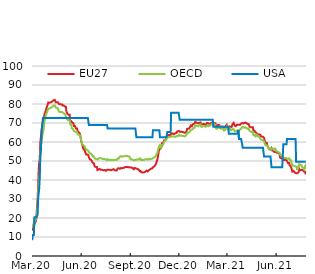
| Category | EU27 | OECD | USA |
|---|---|---|---|
| 2020-03-01 | 13.34 | 15.115 | 8.33 |
| 2020-03-02 | 13.991 | 15.84 | 11.11 |
| 2020-03-03 | 14.334 | 16.241 | 11.11 |
| 2020-03-04 | 15.466 | 17.442 | 11.11 |
| 2020-03-05 | 16.975 | 18.042 | 20.37 |
| 2020-03-06 | 17.592 | 18.493 | 20.37 |
| 2020-03-07 | 17.798 | 18.643 | 20.37 |
| 2020-03-08 | 18.313 | 18.643 | 20.37 |
| 2020-03-09 | 21.518 | 20.857 | 20.37 |
| 2020-03-10 | 26.353 | 24.311 | 20.37 |
| 2020-03-11 | 29.646 | 26.714 | 21.76 |
| 2020-03-12 | 37.071 | 33.184 | 30.09 |
| 2020-03-13 | 45.13 | 37.638 | 30.09 |
| 2020-03-14 | 49.143 | 40.916 | 35.65 |
| 2020-03-15 | 51.046 | 43.03 | 41.2 |
| 2020-03-16 | 59.62 | 53.567 | 52.31 |
| 2020-03-17 | 62.038 | 57.208 | 55.09 |
| 2020-03-18 | 65.192 | 60.161 | 55.09 |
| 2020-03-19 | 67.215 | 61.712 | 67.13 |
| 2020-03-20 | 68.896 | 63.238 | 67.13 |
| 2020-03-21 | 70.507 | 65.29 | 72.69 |
| 2020-03-22 | 71.039 | 66.104 | 72.69 |
| 2020-03-23 | 73.405 | 68.506 | 72.69 |
| 2020-03-24 | 74.64 | 70.846 | 72.69 |
| 2020-03-25 | 75.326 | 72.848 | 72.69 |
| 2020-03-26 | 75.669 | 73.549 | 72.69 |
| 2020-03-27 | 77.212 | 74.75 | 72.69 |
| 2020-03-28 | 78.206 | 75.301 | 72.69 |
| 2020-03-29 | 78.721 | 75.676 | 72.69 |
| 2020-03-30 | 79.733 | 76.84 | 72.69 |
| 2020-03-31 | 80.83 | 77.491 | 72.69 |
| 2020-04-01 | 80.967 | 77.891 | 72.69 |
| 2020-04-02 | 80.658 | 77.715 | 72.69 |
| 2020-04-03 | 80.864 | 77.865 | 72.69 |
| 2020-04-04 | 80.864 | 77.89 | 72.69 |
| 2020-04-05 | 80.864 | 77.89 | 72.69 |
| 2020-04-06 | 81.07 | 78.141 | 72.69 |
| 2020-04-07 | 81.07 | 78.266 | 72.69 |
| 2020-04-08 | 81.516 | 78.766 | 72.69 |
| 2020-04-09 | 81.927 | 79.066 | 72.69 |
| 2020-04-10 | 81.996 | 79.116 | 72.69 |
| 2020-04-11 | 81.996 | 79.092 | 72.69 |
| 2020-04-12 | 82.201 | 79.242 | 72.69 |
| 2020-04-13 | 82.201 | 79.142 | 72.69 |
| 2020-04-14 | 80.899 | 78.166 | 72.69 |
| 2020-04-15 | 80.83 | 77.966 | 72.69 |
| 2020-04-16 | 80.899 | 78.016 | 72.69 |
| 2020-04-17 | 80.899 | 77.941 | 72.69 |
| 2020-04-18 | 80.899 | 77.741 | 72.69 |
| 2020-04-19 | 80.899 | 77.64 | 72.69 |
| 2020-04-20 | 80.007 | 75.988 | 72.69 |
| 2020-04-21 | 79.87 | 75.814 | 72.69 |
| 2020-04-22 | 79.87 | 75.814 | 72.69 |
| 2020-04-23 | 79.767 | 75.738 | 72.69 |
| 2020-04-24 | 79.767 | 75.814 | 72.69 |
| 2020-04-25 | 79.767 | 75.814 | 72.69 |
| 2020-04-26 | 79.767 | 75.714 | 72.69 |
| 2020-04-27 | 79.183 | 75.513 | 72.69 |
| 2020-04-28 | 79.183 | 75.338 | 72.69 |
| 2020-04-29 | 79.183 | 75.237 | 72.69 |
| 2020-04-30 | 78.772 | 74.862 | 72.69 |
| 2020-05-01 | 78.703 | 74.561 | 72.69 |
| 2020-05-02 | 78.6 | 74.486 | 72.69 |
| 2020-05-03 | 78.549 | 74.349 | 72.69 |
| 2020-05-04 | 75.994 | 72.434 | 72.69 |
| 2020-05-05 | 75.548 | 72.034 | 72.69 |
| 2020-05-06 | 74.793 | 71.684 | 72.69 |
| 2020-05-07 | 74.725 | 71.634 | 72.69 |
| 2020-05-08 | 74.348 | 71.484 | 72.69 |
| 2020-05-09 | 74.348 | 71.484 | 72.69 |
| 2020-05-10 | 74.348 | 71.484 | 72.69 |
| 2020-05-11 | 71.124 | 69.382 | 72.69 |
| 2020-05-12 | 70.919 | 69.232 | 72.69 |
| 2020-05-13 | 70.97 | 69.094 | 72.69 |
| 2020-05-14 | 70.541 | 67.205 | 72.69 |
| 2020-05-15 | 70.164 | 66.892 | 72.69 |
| 2020-05-16 | 70.061 | 66.879 | 72.69 |
| 2020-05-17 | 69.907 | 66.767 | 72.69 |
| 2020-05-18 | 68.433 | 65.766 | 72.69 |
| 2020-05-19 | 68.364 | 65.716 | 72.69 |
| 2020-05-20 | 68.364 | 65.541 | 72.69 |
| 2020-05-21 | 67.644 | 65.541 | 72.69 |
| 2020-05-22 | 67.061 | 65.29 | 72.69 |
| 2020-05-23 | 67.061 | 65.29 | 72.69 |
| 2020-05-24 | 67.061 | 65.29 | 72.69 |
| 2020-05-25 | 65.724 | 63.964 | 72.69 |
| 2020-05-26 | 65.209 | 63.889 | 72.69 |
| 2020-05-27 | 65.072 | 63.789 | 72.69 |
| 2020-05-28 | 64.97 | 63.789 | 72.69 |
| 2020-05-29 | 64.558 | 63.726 | 72.69 |
| 2020-05-30 | 63.426 | 62.975 | 72.69 |
| 2020-05-31 | 63.186 | 62.975 | 72.69 |
| 2020-06-01 | 59.927 | 60.247 | 72.69 |
| 2020-06-02 | 59.223 | 59.434 | 72.69 |
| 2020-06-03 | 58.058 | 58.583 | 72.69 |
| 2020-06-04 | 58.058 | 58.583 | 72.69 |
| 2020-06-05 | 56.137 | 58.158 | 72.69 |
| 2020-06-06 | 56.137 | 57.907 | 72.69 |
| 2020-06-07 | 56.137 | 57.907 | 72.69 |
| 2020-06-08 | 54.697 | 56.706 | 72.69 |
| 2020-06-09 | 54.183 | 56.506 | 72.69 |
| 2020-06-10 | 53.463 | 56.131 | 72.69 |
| 2020-06-11 | 53.257 | 55.981 | 72.69 |
| 2020-06-12 | 53.394 | 55.667 | 72.69 |
| 2020-06-13 | 53.189 | 55.517 | 72.69 |
| 2020-06-14 | 53.051 | 55.417 | 72.69 |
| 2020-06-15 | 52.006 | 54.604 | 68.98 |
| 2020-06-16 | 52.006 | 54.604 | 68.98 |
| 2020-06-17 | 50.84 | 54.004 | 68.98 |
| 2020-06-18 | 50.977 | 54.104 | 68.98 |
| 2020-06-19 | 50.634 | 53.929 | 68.98 |
| 2020-06-20 | 50.531 | 53.854 | 68.98 |
| 2020-06-21 | 49.691 | 53.165 | 68.98 |
| 2020-06-22 | 49.143 | 52.415 | 68.98 |
| 2020-06-23 | 49.194 | 52.502 | 68.98 |
| 2020-06-24 | 48.851 | 52.502 | 68.98 |
| 2020-06-25 | 48.851 | 52.502 | 68.98 |
| 2020-06-26 | 47.102 | 51.264 | 68.98 |
| 2020-06-27 | 46.896 | 51.114 | 68.98 |
| 2020-06-28 | 46.896 | 51.114 | 68.98 |
| 2020-06-29 | 46.794 | 51.039 | 68.98 |
| 2020-06-30 | 46.879 | 50.951 | 68.98 |
| 2020-07-01 | 45.234 | 50.526 | 68.98 |
| 2020-07-02 | 45.543 | 50.851 | 68.98 |
| 2020-07-03 | 45.543 | 51.264 | 68.98 |
| 2020-07-04 | 46.023 | 51.476 | 68.98 |
| 2020-07-05 | 45.817 | 51.476 | 68.98 |
| 2020-07-06 | 45.817 | 51.502 | 68.98 |
| 2020-07-07 | 45.405 | 51.276 | 68.98 |
| 2020-07-08 | 45.542 | 51.451 | 68.98 |
| 2020-07-09 | 45.438 | 51.251 | 68.98 |
| 2020-07-10 | 45.404 | 51.151 | 68.98 |
| 2020-07-11 | 45.198 | 51.001 | 68.98 |
| 2020-07-12 | 45.095 | 51.001 | 68.98 |
| 2020-07-13 | 45.095 | 51.001 | 68.98 |
| 2020-07-14 | 45.095 | 51.001 | 68.98 |
| 2020-07-15 | 45.267 | 51.201 | 68.98 |
| 2020-07-16 | 45.061 | 50.951 | 68.98 |
| 2020-07-17 | 44.856 | 50.725 | 68.98 |
| 2020-07-18 | 44.959 | 50.425 | 68.98 |
| 2020-07-19 | 45.37 | 50.725 | 68.98 |
| 2020-07-20 | 45.747 | 51.001 | 67.13 |
| 2020-07-21 | 45.336 | 51.001 | 67.13 |
| 2020-07-22 | 45.336 | 50.425 | 67.13 |
| 2020-07-23 | 45.336 | 50.55 | 67.13 |
| 2020-07-24 | 45.336 | 50.55 | 67.13 |
| 2020-07-25 | 45.336 | 50.55 | 67.13 |
| 2020-07-26 | 45.336 | 50.65 | 67.13 |
| 2020-07-27 | 45.113 | 50.438 | 67.13 |
| 2020-07-28 | 45.113 | 50.438 | 67.13 |
| 2020-07-29 | 45.421 | 50.663 | 67.13 |
| 2020-07-30 | 45.421 | 50.663 | 67.13 |
| 2020-07-31 | 45.73 | 51.014 | 67.13 |
| 2020-08-01 | 45.216 | 50.425 | 67.13 |
| 2020-08-02 | 45.216 | 50.525 | 67.13 |
| 2020-08-03 | 45.113 | 50.551 | 67.13 |
| 2020-08-04 | 45.01 | 50.551 | 67.13 |
| 2020-08-05 | 45.01 | 50.701 | 67.13 |
| 2020-08-06 | 45.01 | 50.801 | 67.13 |
| 2020-08-07 | 45.25 | 50.651 | 67.13 |
| 2020-08-08 | 46.09 | 51.264 | 67.13 |
| 2020-08-09 | 46.296 | 51.414 | 67.13 |
| 2020-08-10 | 46.159 | 51.264 | 67.13 |
| 2020-08-11 | 45.953 | 51.114 | 67.13 |
| 2020-08-12 | 45.884 | 52.327 | 67.13 |
| 2020-08-13 | 46.296 | 52.527 | 67.13 |
| 2020-08-14 | 46.33 | 52.552 | 67.13 |
| 2020-08-15 | 46.33 | 52.552 | 67.13 |
| 2020-08-16 | 46.124 | 52.252 | 67.13 |
| 2020-08-17 | 45.867 | 52.064 | 67.13 |
| 2020-08-18 | 46.382 | 52.44 | 67.13 |
| 2020-08-19 | 46.485 | 52.44 | 67.13 |
| 2020-08-20 | 46.485 | 52.54 | 67.13 |
| 2020-08-21 | 46.69 | 52.615 | 67.13 |
| 2020-08-22 | 46.793 | 52.615 | 67.13 |
| 2020-08-23 | 46.793 | 52.69 | 67.13 |
| 2020-08-24 | 46.896 | 52.765 | 67.13 |
| 2020-08-25 | 46.896 | 52.69 | 67.13 |
| 2020-08-26 | 46.896 | 52.69 | 67.13 |
| 2020-08-27 | 46.691 | 52.54 | 67.13 |
| 2020-08-28 | 46.691 | 52.315 | 67.13 |
| 2020-08-29 | 46.691 | 52.315 | 67.13 |
| 2020-08-30 | 46.691 | 52.315 | 67.13 |
| 2020-08-31 | 46.691 | 51.689 | 67.13 |
| 2020-09-01 | 46.537 | 51.001 | 67.13 |
| 2020-09-02 | 46.4 | 50.826 | 67.13 |
| 2020-09-03 | 46.554 | 50.864 | 67.13 |
| 2020-09-04 | 46.16 | 50.651 | 67.13 |
| 2020-09-05 | 46.16 | 50.651 | 67.13 |
| 2020-09-06 | 46.091 | 50.601 | 67.13 |
| 2020-09-07 | 45.714 | 50.275 | 67.13 |
| 2020-09-08 | 46.349 | 50.488 | 67.13 |
| 2020-09-09 | 46.229 | 50.551 | 67.13 |
| 2020-09-10 | 46.229 | 50.926 | 67.13 |
| 2020-09-11 | 45.989 | 50.551 | 67.13 |
| 2020-09-12 | 45.989 | 50.814 | 62.5 |
| 2020-09-13 | 45.989 | 50.814 | 62.5 |
| 2020-09-14 | 45.68 | 50.776 | 62.5 |
| 2020-09-15 | 45.594 | 50.814 | 62.5 |
| 2020-09-16 | 45.594 | 50.814 | 62.5 |
| 2020-09-17 | 45.629 | 50.839 | 62.5 |
| 2020-09-18 | 44.668 | 51.389 | 62.5 |
| 2020-09-19 | 44.788 | 51.477 | 62.5 |
| 2020-09-20 | 44.685 | 51.277 | 62.5 |
| 2020-09-21 | 44.067 | 50.526 | 62.5 |
| 2020-09-22 | 43.999 | 50.576 | 62.5 |
| 2020-09-23 | 43.999 | 50.501 | 62.5 |
| 2020-09-24 | 43.999 | 50.401 | 62.5 |
| 2020-09-25 | 43.999 | 50.501 | 62.5 |
| 2020-09-26 | 44.102 | 50.576 | 62.5 |
| 2020-09-27 | 44.102 | 50.576 | 62.5 |
| 2020-09-28 | 44.102 | 50.689 | 62.5 |
| 2020-09-29 | 44.462 | 50.952 | 62.5 |
| 2020-09-30 | 44.256 | 50.801 | 62.5 |
| 2020-10-01 | 44.925 | 50.914 | 62.5 |
| 2020-10-02 | 44.822 | 50.839 | 62.5 |
| 2020-10-03 | 44.513 | 50.688 | 62.5 |
| 2020-10-04 | 44.513 | 50.613 | 62.5 |
| 2020-10-05 | 45.045 | 51.176 | 62.5 |
| 2020-10-06 | 45.148 | 51.302 | 62.5 |
| 2020-10-07 | 45.456 | 50.889 | 62.5 |
| 2020-10-08 | 45.456 | 50.889 | 62.5 |
| 2020-10-09 | 45.919 | 51.152 | 62.5 |
| 2020-10-10 | 45.885 | 51.052 | 62.5 |
| 2020-10-11 | 46.039 | 51.164 | 62.5 |
| 2020-10-12 | 46.382 | 51.126 | 62.5 |
| 2020-10-13 | 46.639 | 51.465 | 66.2 |
| 2020-10-14 | 46.536 | 51.389 | 66.2 |
| 2020-10-15 | 47.153 | 51.84 | 66.2 |
| 2020-10-16 | 47.153 | 51.79 | 66.2 |
| 2020-10-17 | 47.719 | 52.203 | 66.2 |
| 2020-10-18 | 47.582 | 52.203 | 66.2 |
| 2020-10-19 | 48.714 | 53.028 | 66.2 |
| 2020-10-20 | 49.777 | 53.629 | 66.2 |
| 2020-10-21 | 50.583 | 54.217 | 66.2 |
| 2020-10-22 | 51.886 | 55.218 | 66.2 |
| 2020-10-23 | 53.635 | 56.257 | 66.2 |
| 2020-10-24 | 55.401 | 57.546 | 66.2 |
| 2020-10-25 | 55.864 | 57.734 | 66.2 |
| 2020-10-26 | 56.413 | 58.359 | 62.5 |
| 2020-10-27 | 56.739 | 58.596 | 62.5 |
| 2020-10-28 | 56.944 | 57.17 | 62.5 |
| 2020-10-29 | 57.476 | 57.032 | 62.5 |
| 2020-10-30 | 59.345 | 58.446 | 62.5 |
| 2020-10-31 | 59.345 | 58.596 | 62.5 |
| 2020-11-01 | 59.345 | 58.521 | 62.5 |
| 2020-11-02 | 60.254 | 59.66 | 62.5 |
| 2020-11-03 | 60.906 | 59.986 | 62.5 |
| 2020-11-04 | 60.631 | 60.461 | 62.5 |
| 2020-11-05 | 60.906 | 60.986 | 62.5 |
| 2020-11-06 | 60.906 | 61.012 | 62.5 |
| 2020-11-07 | 61.626 | 61.587 | 62.5 |
| 2020-11-08 | 61.626 | 61.637 | 62.5 |
| 2020-11-09 | 62.929 | 62.163 | 65.28 |
| 2020-11-10 | 63.58 | 62.588 | 65.28 |
| 2020-11-11 | 63.58 | 62.625 | 65.28 |
| 2020-11-12 | 63.683 | 62.625 | 65.28 |
| 2020-11-13 | 63.683 | 62.625 | 65.28 |
| 2020-11-14 | 63.683 | 62.625 | 65.28 |
| 2020-11-15 | 63.683 | 62.625 | 65.28 |
| 2020-11-16 | 64.403 | 62.875 | 75.46 |
| 2020-11-17 | 64.677 | 63.075 | 75.46 |
| 2020-11-18 | 64.54 | 63.075 | 75.46 |
| 2020-11-19 | 64.3 | 62.9 | 75.46 |
| 2020-11-20 | 64.3 | 63.075 | 75.46 |
| 2020-11-21 | 64.574 | 63.025 | 75.46 |
| 2020-11-22 | 64.231 | 62.637 | 75.46 |
| 2020-11-23 | 64.351 | 62.725 | 75.46 |
| 2020-11-24 | 64.591 | 62.825 | 75.46 |
| 2020-11-25 | 64.591 | 62.825 | 75.46 |
| 2020-11-26 | 64.729 | 62.875 | 75.46 |
| 2020-11-27 | 65.483 | 63.176 | 75.46 |
| 2020-11-28 | 65.655 | 63.076 | 75.46 |
| 2020-11-29 | 65.655 | 63.076 | 75.46 |
| 2020-11-30 | 65.654 | 63.351 | 75.46 |
| 2020-12-01 | 65.792 | 63.864 | 75.46 |
| 2020-12-02 | 65.381 | 63.564 | 71.76 |
| 2020-12-03 | 65.312 | 63.314 | 71.76 |
| 2020-12-04 | 65.381 | 63.364 | 71.76 |
| 2020-12-05 | 65.381 | 63.364 | 71.76 |
| 2020-12-06 | 65.381 | 63.364 | 71.76 |
| 2020-12-07 | 65.312 | 63.214 | 71.76 |
| 2020-12-08 | 65.312 | 63.314 | 71.76 |
| 2020-12-09 | 65.141 | 63.189 | 71.76 |
| 2020-12-10 | 65.141 | 63.189 | 71.76 |
| 2020-12-11 | 64.832 | 62.964 | 71.76 |
| 2020-12-12 | 65.004 | 63.164 | 71.76 |
| 2020-12-13 | 65.004 | 63.164 | 71.76 |
| 2020-12-14 | 65.518 | 63.589 | 71.76 |
| 2020-12-15 | 65.758 | 63.89 | 71.76 |
| 2020-12-16 | 66.924 | 64.74 | 71.76 |
| 2020-12-17 | 66.924 | 64.74 | 71.76 |
| 2020-12-18 | 67.061 | 64.84 | 71.76 |
| 2020-12-19 | 67.095 | 65.191 | 71.76 |
| 2020-12-20 | 67.095 | 65.191 | 71.76 |
| 2020-12-21 | 67.747 | 65.441 | 71.76 |
| 2020-12-22 | 67.816 | 65.841 | 71.76 |
| 2020-12-23 | 68.707 | 66.342 | 71.76 |
| 2020-12-24 | 68.33 | 66.417 | 71.76 |
| 2020-12-25 | 68.33 | 66.304 | 71.76 |
| 2020-12-26 | 69.05 | 66.717 | 71.76 |
| 2020-12-27 | 69.427 | 67.218 | 71.76 |
| 2020-12-28 | 69.564 | 67.318 | 71.76 |
| 2020-12-29 | 69.427 | 67.318 | 71.76 |
| 2020-12-30 | 69.701 | 67.593 | 71.76 |
| 2020-12-31 | 70.524 | 68.819 | 71.76 |
| 2021-01-01 | 70.661 | 68.844 | 71.76 |
| 2021-01-02 | 70.352 | 68.656 | 71.76 |
| 2021-01-03 | 70.352 | 68.656 | 71.76 |
| 2021-01-04 | 69.941 | 68.418 | 71.76 |
| 2021-01-05 | 69.907 | 68.656 | 71.76 |
| 2021-01-06 | 69.907 | 68.331 | 71.76 |
| 2021-01-07 | 69.804 | 68.794 | 71.76 |
| 2021-01-08 | 70.147 | 69.044 | 71.76 |
| 2021-01-09 | 70.147 | 69.395 | 71.76 |
| 2021-01-10 | 70.319 | 69.245 | 71.76 |
| 2021-01-11 | 69.359 | 68.118 | 71.76 |
| 2021-01-12 | 69.359 | 68.118 | 71.76 |
| 2021-01-13 | 69.359 | 67.968 | 71.76 |
| 2021-01-14 | 69.359 | 67.968 | 71.76 |
| 2021-01-15 | 69.427 | 68.243 | 71.76 |
| 2021-01-16 | 69.427 | 68.394 | 71.76 |
| 2021-01-17 | 69.427 | 68.394 | 71.76 |
| 2021-01-18 | 68.947 | 68.043 | 71.76 |
| 2021-01-19 | 68.947 | 68.043 | 71.76 |
| 2021-01-20 | 69.084 | 68.143 | 71.76 |
| 2021-01-21 | 69.29 | 68.293 | 71.76 |
| 2021-01-22 | 69.976 | 68.794 | 71.76 |
| 2021-01-23 | 69.907 | 68.844 | 71.76 |
| 2021-01-24 | 69.907 | 68.844 | 71.76 |
| 2021-01-25 | 69.496 | 68.294 | 71.76 |
| 2021-01-26 | 69.599 | 68.519 | 71.76 |
| 2021-01-27 | 69.701 | 68.594 | 71.76 |
| 2021-01-28 | 69.701 | 68.594 | 71.76 |
| 2021-01-29 | 70.044 | 68.919 | 71.76 |
| 2021-01-30 | 70.147 | 69.094 | 71.76 |
| 2021-01-31 | 70.147 | 69.569 | 71.76 |
| 2021-02-01 | 69.496 | 69.344 | 71.76 |
| 2021-02-02 | 69.496 | 69.344 | 71.76 |
| 2021-02-03 | 69.461 | 69.319 | 68.06 |
| 2021-02-04 | 69.461 | 69.319 | 68.06 |
| 2021-02-05 | 69.873 | 69.219 | 68.06 |
| 2021-02-06 | 69.873 | 69.219 | 68.06 |
| 2021-02-07 | 69.873 | 68.619 | 68.06 |
| 2021-02-08 | 68.536 | 67.179 | 68.06 |
| 2021-02-09 | 68.33 | 66.954 | 68.06 |
| 2021-02-10 | 68.33 | 66.954 | 68.06 |
| 2021-02-11 | 68.433 | 66.979 | 68.06 |
| 2021-02-12 | 68.947 | 67.755 | 68.06 |
| 2021-02-13 | 68.947 | 67.755 | 68.06 |
| 2021-02-14 | 68.947 | 67.755 | 68.06 |
| 2021-02-15 | 67.541 | 68.344 | 68.06 |
| 2021-02-16 | 67.439 | 68.193 | 68.06 |
| 2021-02-17 | 67.439 | 68.193 | 68.06 |
| 2021-02-18 | 67.439 | 66.967 | 68.06 |
| 2021-02-19 | 67.747 | 67.192 | 68.06 |
| 2021-02-20 | 67.679 | 67.142 | 68.06 |
| 2021-02-21 | 68.056 | 67.142 | 68.06 |
| 2021-02-22 | 67.576 | 66.692 | 68.06 |
| 2021-02-23 | 67.576 | 66.029 | 68.06 |
| 2021-02-24 | 67.576 | 66.029 | 68.06 |
| 2021-02-25 | 67.576 | 66.454 | 68.06 |
| 2021-02-26 | 68.364 | 67.029 | 68.06 |
| 2021-02-27 | 68.741 | 67.267 | 68.06 |
| 2021-02-28 | 69.05 | 68.155 | 68.06 |
| 2021-03-01 | 68.021 | 67.28 | 68.06 |
| 2021-03-02 | 67.644 | 66.641 | 68.06 |
| 2021-03-03 | 67.507 | 66.541 | 68.06 |
| 2021-03-04 | 67.507 | 66.541 | 64.35 |
| 2021-03-05 | 68.193 | 67.042 | 64.35 |
| 2021-03-06 | 68.056 | 67.016 | 64.35 |
| 2021-03-07 | 68.056 | 66.241 | 64.35 |
| 2021-03-08 | 68.159 | 66.216 | 64.35 |
| 2021-03-09 | 67.85 | 66.191 | 64.35 |
| 2021-03-10 | 67.85 | 66.191 | 64.35 |
| 2021-03-11 | 69.359 | 66.892 | 64.35 |
| 2021-03-12 | 69.77 | 66.804 | 64.35 |
| 2021-03-13 | 70.061 | 66.754 | 64.35 |
| 2021-03-14 | 70.061 | 66.754 | 64.35 |
| 2021-03-15 | 68.639 | 65.678 | 64.35 |
| 2021-03-16 | 68.261 | 65.553 | 64.35 |
| 2021-03-17 | 68.33 | 65.603 | 64.35 |
| 2021-03-18 | 68.33 | 65.603 | 64.35 |
| 2021-03-19 | 69.05 | 66.128 | 64.35 |
| 2021-03-20 | 69.118 | 66.228 | 64.35 |
| 2021-03-21 | 69.118 | 66.228 | 64.35 |
| 2021-03-22 | 69.083 | 65.928 | 66.2 |
| 2021-03-23 | 69.083 | 65.928 | 61.57 |
| 2021-03-24 | 69.083 | 65.928 | 61.57 |
| 2021-03-25 | 69.083 | 66.603 | 61.57 |
| 2021-03-26 | 69.427 | 67.004 | 61.57 |
| 2021-03-27 | 69.667 | 66.954 | 61.57 |
| 2021-03-28 | 69.667 | 66.954 | 61.57 |
| 2021-03-29 | 70.01 | 67.88 | 58.8 |
| 2021-03-30 | 69.736 | 67.83 | 56.94 |
| 2021-03-31 | 69.736 | 67.83 | 56.94 |
| 2021-04-01 | 69.976 | 67.53 | 56.94 |
| 2021-04-02 | 69.907 | 67.53 | 56.94 |
| 2021-04-03 | 70.25 | 67.78 | 56.94 |
| 2021-04-04 | 70.25 | 67.78 | 56.94 |
| 2021-04-05 | 69.804 | 67.492 | 56.94 |
| 2021-04-06 | 69.941 | 67.342 | 56.94 |
| 2021-04-07 | 69.461 | 66.991 | 56.94 |
| 2021-04-08 | 69.461 | 66.991 | 56.94 |
| 2021-04-09 | 69.461 | 67.066 | 56.94 |
| 2021-04-10 | 69.461 | 67.066 | 56.94 |
| 2021-04-11 | 69.461 | 67.066 | 56.94 |
| 2021-04-12 | 68.021 | 65.79 | 56.94 |
| 2021-04-13 | 67.815 | 65.44 | 56.94 |
| 2021-04-14 | 67.815 | 65.44 | 56.94 |
| 2021-04-15 | 67.815 | 65.39 | 56.94 |
| 2021-04-16 | 67.815 | 65.315 | 56.94 |
| 2021-04-17 | 67.815 | 65.315 | 56.94 |
| 2021-04-18 | 67.815 | 65.265 | 56.94 |
| 2021-04-19 | 66.066 | 63.588 | 56.94 |
| 2021-04-20 | 66.066 | 63.588 | 56.94 |
| 2021-04-21 | 65.963 | 63.513 | 56.94 |
| 2021-04-22 | 65.346 | 63.138 | 56.94 |
| 2021-04-23 | 64.935 | 62.988 | 56.94 |
| 2021-04-24 | 64.935 | 63.964 | 56.94 |
| 2021-04-25 | 64.935 | 64.064 | 56.94 |
| 2021-04-26 | 64.249 | 63.764 | 56.94 |
| 2021-04-27 | 63.975 | 63.013 | 56.94 |
| 2021-04-28 | 63.837 | 62.913 | 56.94 |
| 2021-04-29 | 63.94 | 62.763 | 56.94 |
| 2021-04-30 | 64.009 | 62.713 | 56.94 |
| 2021-05-01 | 63.803 | 62.312 | 56.94 |
| 2021-05-02 | 63.803 | 62.412 | 56.94 |
| 2021-05-03 | 62.911 | 61.299 | 56.94 |
| 2021-05-04 | 62.843 | 61.098 | 56.94 |
| 2021-05-05 | 62.843 | 61.098 | 56.94 |
| 2021-05-06 | 62.74 | 60.898 | 56.94 |
| 2021-05-07 | 62.74 | 60.898 | 56.94 |
| 2021-05-08 | 62.5 | 60.623 | 56.94 |
| 2021-05-09 | 62.209 | 60.411 | 52.31 |
| 2021-05-10 | 60.631 | 59.409 | 52.31 |
| 2021-05-11 | 60.289 | 58.784 | 52.31 |
| 2021-05-12 | 59.534 | 58.233 | 52.31 |
| 2021-05-13 | 59.534 | 58.233 | 52.31 |
| 2021-05-14 | 59.534 | 58.233 | 52.31 |
| 2021-05-15 | 58.128 | 57.858 | 52.31 |
| 2021-05-16 | 57.751 | 57.632 | 52.31 |
| 2021-05-17 | 57.134 | 57.057 | 52.31 |
| 2021-05-18 | 56.447 | 56.206 | 52.31 |
| 2021-05-19 | 56.207 | 56.031 | 52.31 |
| 2021-05-20 | 56.105 | 56.031 | 52.31 |
| 2021-05-21 | 55.865 | 55.931 | 52.31 |
| 2021-05-22 | 55.796 | 55.881 | 52.31 |
| 2021-05-23 | 56.722 | 56.632 | 46.76 |
| 2021-05-24 | 56.414 | 56.607 | 46.76 |
| 2021-05-25 | 55.728 | 56.482 | 46.76 |
| 2021-05-26 | 55.728 | 56.557 | 46.76 |
| 2021-05-27 | 54.974 | 56.006 | 46.76 |
| 2021-05-28 | 54.768 | 56.607 | 46.76 |
| 2021-05-29 | 54.768 | 56.557 | 46.76 |
| 2021-05-30 | 54.768 | 56.557 | 46.76 |
| 2021-05-31 | 54.699 | 56.431 | 46.76 |
| 2021-06-01 | 54.459 | 55.13 | 46.76 |
| 2021-06-02 | 54.356 | 55.055 | 46.76 |
| 2021-06-03 | 54.356 | 55.055 | 46.76 |
| 2021-06-04 | 54.253 | 54.88 | 46.76 |
| 2021-06-05 | 54.253 | 54.58 | 46.76 |
| 2021-06-06 | 54.081 | 54.455 | 46.76 |
| 2021-06-07 | 53.327 | 54.367 | 46.76 |
| 2021-06-08 | 51.852 | 53.341 | 46.76 |
| 2021-06-09 | 51.749 | 53.165 | 46.76 |
| 2021-06-10 | 51.44 | 52.94 | 46.76 |
| 2021-06-11 | 51.269 | 52.315 | 46.76 |
| 2021-06-12 | 51.269 | 52.315 | 46.76 |
| 2021-06-13 | 51.269 | 52.315 | 46.76 |
| 2021-06-14 | 51.063 | 52.165 | 58.8 |
| 2021-06-15 | 50.481 | 51.564 | 58.8 |
| 2021-06-16 | 50.481 | 51.564 | 58.8 |
| 2021-06-17 | 50.481 | 51.564 | 58.8 |
| 2021-06-18 | 50.686 | 51.639 | 58.8 |
| 2021-06-19 | 50.686 | 51.639 | 58.8 |
| 2021-06-20 | 50.412 | 51.489 | 58.8 |
| 2021-06-21 | 49.983 | 51.126 | 61.57 |
| 2021-06-22 | 49.469 | 51.201 | 61.57 |
| 2021-06-23 | 48.843 | 51.126 | 61.57 |
| 2021-06-24 | 48.843 | 51.126 | 61.57 |
| 2021-06-25 | 48.95 | 51.402 | 61.57 |
| 2021-06-26 | 47.668 | 50.501 | 61.57 |
| 2021-06-27 | 47.668 | 50.601 | 61.57 |
| 2021-06-28 | 47.329 | 50.463 | 61.57 |
| 2021-06-29 | 46.368 | 49.688 | 61.57 |
| 2021-06-30 | 46.528 | 49.383 | 61.57 |
| 2021-07-01 | 44.408 | 47.531 | 61.57 |
| 2021-07-02 | 44.693 | 47.737 | 61.57 |
| 2021-07-03 | 44.693 | 47.608 | 61.57 |
| 2021-07-04 | 44.693 | 47.608 | 61.57 |
| 2021-07-05 | 44.159 | 47.377 | 61.57 |
| 2021-07-06 | 43.679 | 47.081 | 61.57 |
| 2021-07-07 | 43.679 | 47.081 | 61.57 |
| 2021-07-08 | 43.679 | 47.004 | 49.54 |
| 2021-07-09 | 43.537 | 46.901 | 49.54 |
| 2021-07-10 | 43.679 | 45.281 | 49.54 |
| 2021-07-11 | 43.679 | 47.004 | 49.54 |
| 2021-07-12 | 43.679 | 47.3 | 49.54 |
| 2021-07-13 | 44.387 | 47.54 | 49.54 |
| 2021-07-14 | 45.718 | 48.347 | 49.54 |
| 2021-07-15 | 45.101 | 47.924 | 49.54 |
| 2021-07-16 | 45.101 | 47.712 | 49.54 |
| 2021-07-17 | 45.178 | 47.765 | 49.54 |
| 2021-07-18 | 45.178 | 47.765 | 49.54 |
| 2021-07-19 | 45.409 | 47.712 | 49.54 |
| 2021-07-20 | 45.04 | 46.528 | 49.54 |
| 2021-07-21 | 45.04 | 46.404 | 49.54 |
| 2021-07-22 | 45.04 | 46.404 | 49.54 |
| 2021-07-23 | 44.393 | 45.767 | 49.54 |
| 2021-07-24 | 44.357 | 46.658 | 49.54 |
| 2021-07-25 | 44.357 | 47.302 | 49.54 |
| 2021-07-26 | 42.923 | 45.679 | 49.54 |